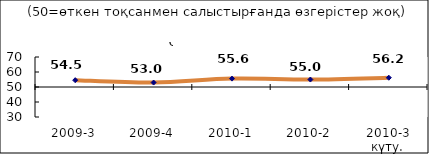
| Category | Диф.индекс ↓ |
|---|---|
| 2009-3 | 54.535 |
| 2009-4 | 52.96 |
| 2010-1 | 55.59 |
| 2010-2 | 54.975 |
| 2010-3 күту. | 56.185 |